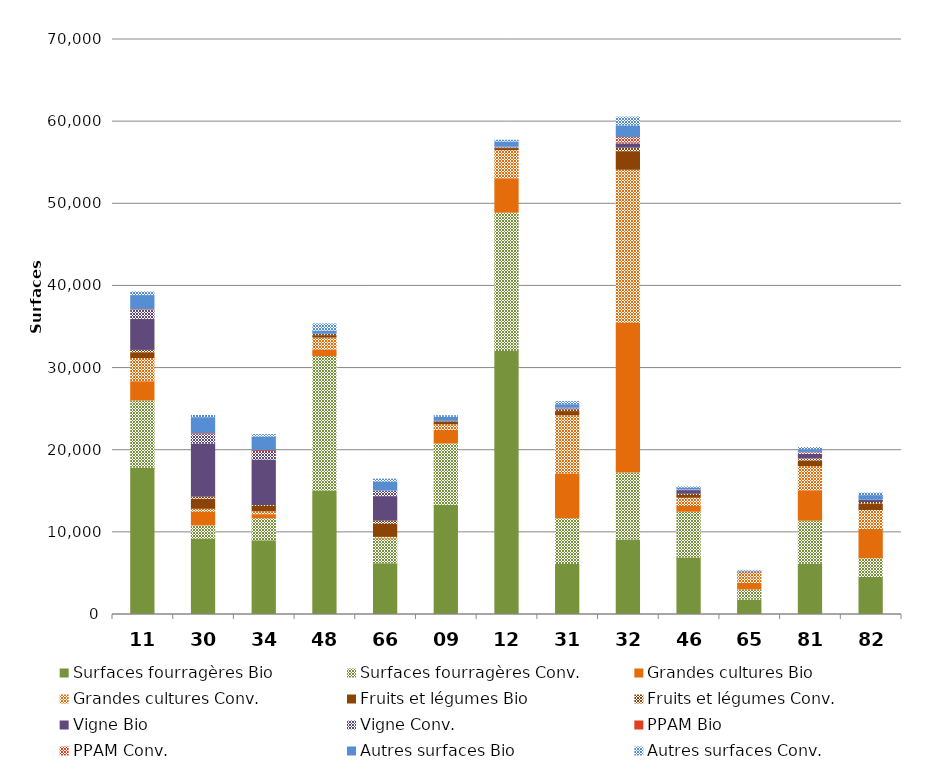
| Category | Surfaces fourragères Bio | Surfaces fourragères Conv. | Grandes cultures Bio | Grandes cultures Conv. | Fruits et légumes Bio | Fruits et légumes Conv. | Vigne Bio | Vigne Conv. | PPAM Bio | PPAM Conv. | Autres surfaces Bio | Autres surfaces Conv. |
|---|---|---|---|---|---|---|---|---|---|---|---|---|
| 11 | 17801.756 | 8188.817 | 2350.813 | 2825.27 | 700.567 | 281.63 | 3785.056 | 1105.082 | 67.914 | 1.49 | 1718.429 | 449.834 |
| 30 | 9177.198 | 1606.935 | 1654.923 | 364.707 | 1245.843 | 223.208 | 6472.173 | 1153.43 | 105.852 | 6.144 | 1954.135 | 264.512 |
| 34 | 8976.57 | 2687.205 | 489.966 | 342.124 | 671.806 | 104.98 | 5535.113 | 1046.861 | 109.844 | 1.605 | 1631.124 | 305.215 |
| 48 | 15020.333 | 16380.799 | 788.34 | 1459.34 | 300.486 | 157.47 | 0.111 | 0 | 4.493 | 0.56 | 400.749 | 861.5 |
| 66 | 6182.991 | 3000.839 | 79.08 | 123.48 | 1591.935 | 377.332 | 2995.879 | 651.122 | 19.144 | 7.24 | 1095.719 | 356.596 |
| 09 | 13310.957 | 7446.68 | 1659.2 | 676.47 | 340.849 | 24.69 | 31.38 | 13.38 | 11.588 | 0.2 | 490.517 | 194.89 |
| 12 | 32014.449 | 16837.029 | 4197.7 | 3414.09 | 259.494 | 68.02 | 49.848 | 29.04 | 7.489 | 8.03 | 641.781 | 212.191 |
| 31 | 6096.55 | 5545.04 | 5453.3 | 7099.48 | 511.833 | 208.91 | 118.505 | 40.449 | 33.12 | 3.65 | 431.014 | 378.6 |
| 32 | 9056.081 | 8168.98 | 18227.2 | 18627.542 | 2266.76 | 414.955 | 527.357 | 64.92 | 74.16 | 636.53 | 1418.599 | 1067.088 |
| 46 | 6888.618 | 5560.951 | 697.86 | 996.28 | 349.701 | 137.018 | 452.122 | 52.913 | 11.3 | 2.624 | 230.425 | 165.44 |
| 65 | 1749.023 | 1241.24 | 806.39 | 1178.08 | 68.55 | 130.67 | 15.487 | 12.193 | 4.45 | 0.01 | 84.26 | 77.3 |
| 81 | 6131.584 | 5223.41 | 3709.517 | 2939.44 | 689.444 | 242.23 | 560.835 | 164 | 43.845 | 23.6 | 333.219 | 266.27 |
| 82 | 4509.666 | 2271.35 | 3571.6 | 2311.16 | 791.96 | 180.861 | 245.793 | 18.99 | 12.78 | 0 | 559.604 | 319.958 |